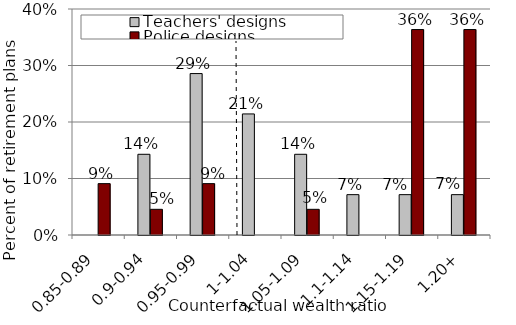
| Category | Teachers' designs | Police designs |
|---|---|---|
| 0.85-0.89 | 0 | 0.091 |
| 0.9-0.94 | 0.143 | 0.045 |
| 0.95-0.99 | 0.286 | 0.091 |
| 1-1.04 | 0.214 | 0 |
| 1.05-1.09 | 0.143 | 0.045 |
| 1.1-1.14 | 0.071 | 0 |
| 1.15-1.19 | 0.071 | 0.364 |
| 1.20+ | 0.071 | 0.364 |